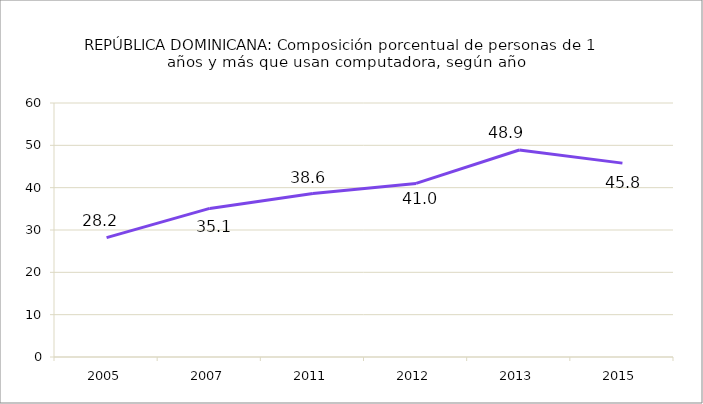
| Category |    Porcentaje de personas  |
|---|---|
| 2005.0 | 28.2 |
| 2007.0 | 35.1 |
| 2011.0 | 38.6 |
| 2012.0 | 41 |
| 2013.0 | 48.9 |
| 2015.0 | 45.8 |